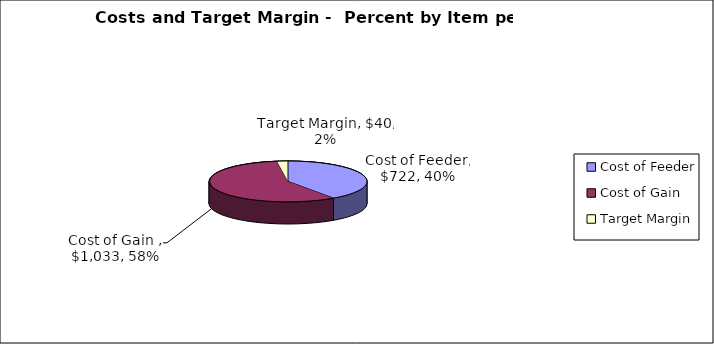
| Category | Series 0 |
|---|---|
| Cost of Feeder | 722.167 |
| Cost of Gain  | 1032.555 |
| Target Margin | 40 |